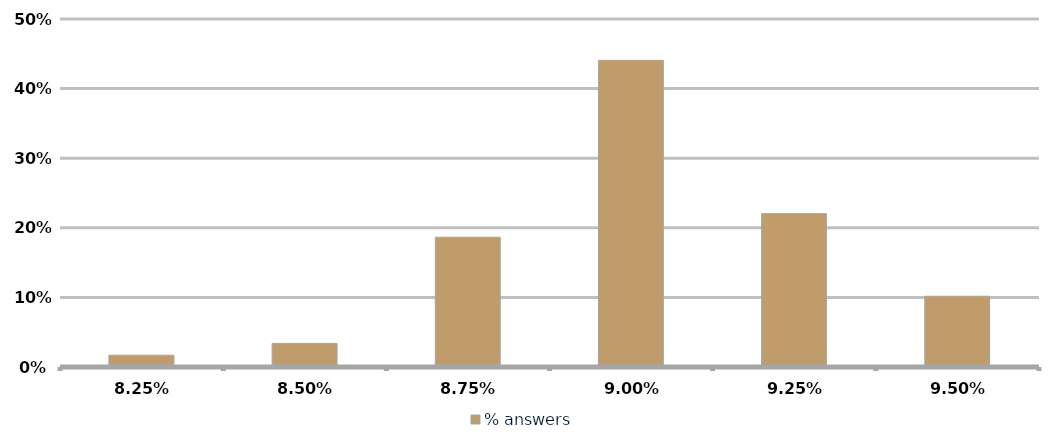
| Category | % answers |
|---|---|
| 0.08249999999999999 | 0.017 |
| 0.08499999999999999 | 0.034 |
| 0.0875 | 0.186 |
| 0.09 | 0.441 |
| 0.0925 | 0.22 |
| 0.095 | 0.102 |